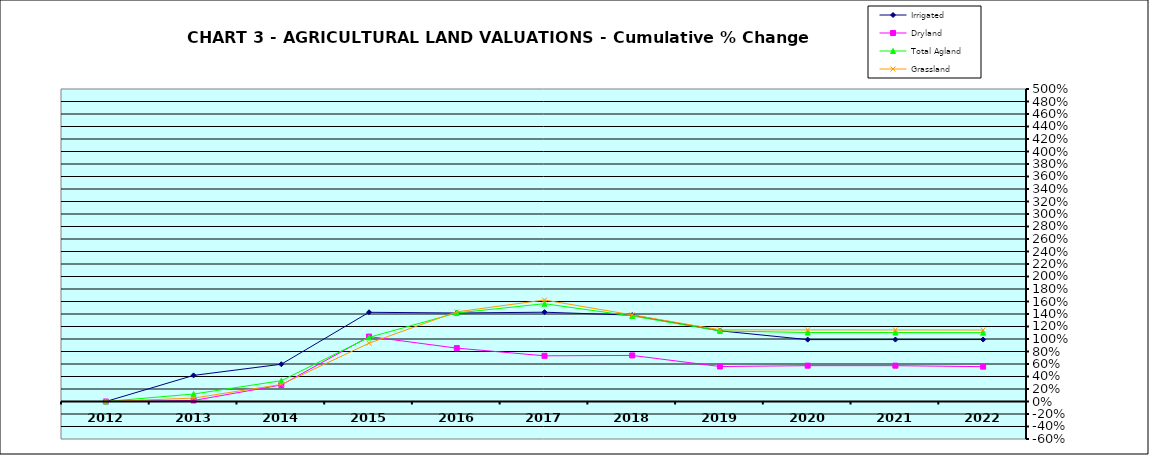
| Category | Irrigated | Dryland | Total Agland | Grassland |
|---|---|---|---|---|
| 2012.0 | 0 | 0 | 0 | 0 |
| 2013.0 | 0.418 | 0.016 | 0.12 | 0.055 |
| 2014.0 | 0.596 | 0.265 | 0.333 | 0.272 |
| 2015.0 | 1.427 | 1.039 | 1.026 | 0.932 |
| 2016.0 | 1.416 | 0.854 | 1.417 | 1.435 |
| 2017.0 | 1.429 | 0.731 | 1.565 | 1.624 |
| 2018.0 | 1.382 | 0.737 | 1.368 | 1.385 |
| 2019.0 | 1.131 | 0.56 | 1.129 | 1.147 |
| 2020.0 | 0.99 | 0.573 | 1.104 | 1.146 |
| 2021.0 | 0.991 | 0.573 | 1.103 | 1.145 |
| 2022.0 | 0.991 | 0.557 | 1.102 | 1.144 |